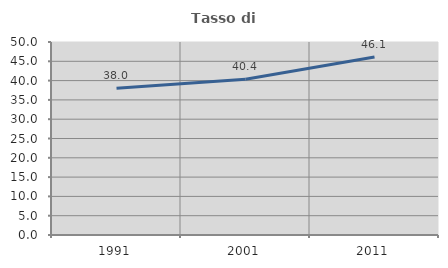
| Category | Tasso di occupazione   |
|---|---|
| 1991.0 | 38.019 |
| 2001.0 | 40.367 |
| 2011.0 | 46.137 |